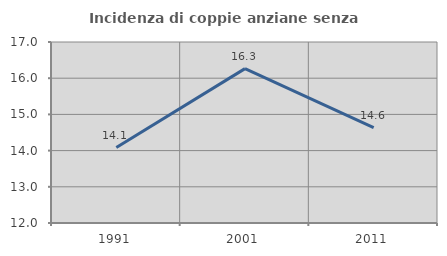
| Category | Incidenza di coppie anziane senza figli  |
|---|---|
| 1991.0 | 14.085 |
| 2001.0 | 16.265 |
| 2011.0 | 14.634 |